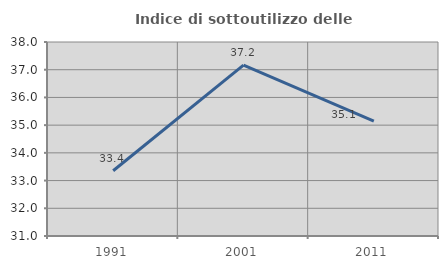
| Category | Indice di sottoutilizzo delle abitazioni  |
|---|---|
| 1991.0 | 33.355 |
| 2001.0 | 37.164 |
| 2011.0 | 35.144 |